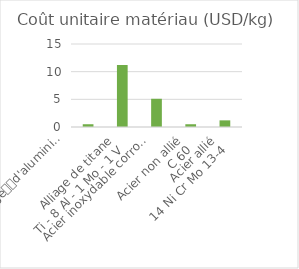
| Category | Alliage
d'aluminium
4032-T6
(Al Si 12,5 Mg Cu Ni) |
|---|---|
| Alliage
d'aluminium
4032-T6
(Al Si 12,5 Mg Cu Ni) | 0.5 |
| Alliage de titane
Ti - 8 Al - 1 Mo - 1 V | 11.2 |
| Acier inoxydable corroyé
X6 Cr Ni Ti 18-10 | 5.1 |
| Acier non allié
C 60 | 0.5 |
| Acier allié
14 Ni Cr Mo 13-4 | 1.2 |